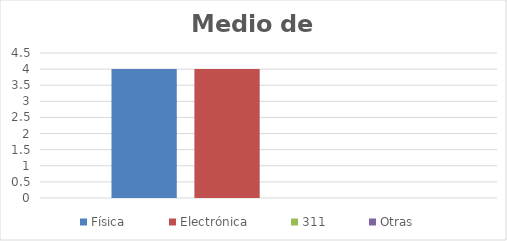
| Category | Física | Electrónica | 311 | Otras |
|---|---|---|---|---|
| 0 | 4 | 4 | 0 | 0 |